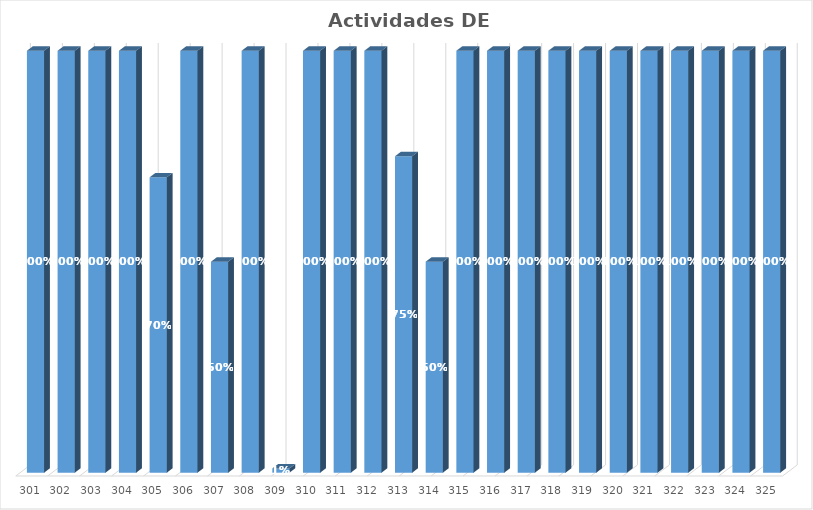
| Category | % Avance |
|---|---|
| 301.0 | 1 |
| 302.0 | 1 |
| 303.0 | 1 |
| 304.0 | 1 |
| 305.0 | 0.7 |
| 306.0 | 1 |
| 307.0 | 0.5 |
| 308.0 | 1 |
| 309.0 | 0.01 |
| 310.0 | 1 |
| 311.0 | 1 |
| 312.0 | 1 |
| 313.0 | 0.75 |
| 314.0 | 0.5 |
| 315.0 | 1 |
| 316.0 | 1 |
| 317.0 | 1 |
| 318.0 | 1 |
| 319.0 | 1 |
| 320.0 | 1 |
| 321.0 | 1 |
| 322.0 | 1 |
| 323.0 | 1 |
| 324.0 | 1 |
| 325.0 | 1 |